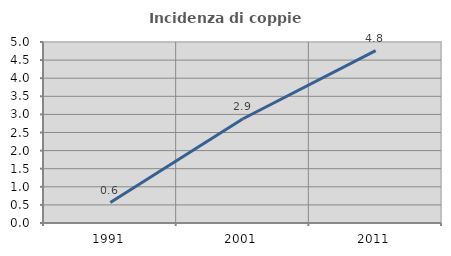
| Category | Incidenza di coppie miste |
|---|---|
| 1991.0 | 0.563 |
| 2001.0 | 2.88 |
| 2011.0 | 4.762 |